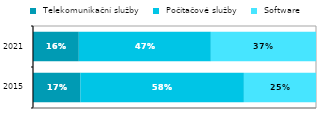
| Category |  Telekomunikační služby |  Počítačové služby |  Software |
|---|---|---|---|
|  2015 | 0.167 | 0.578 | 0.255 |
| 2021 | 0.162 | 0.467 | 0.372 |